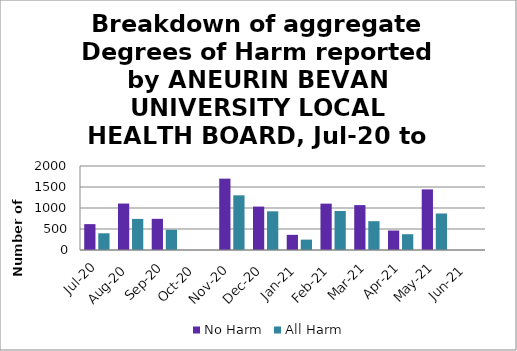
| Category | No Harm | All Harm |
|---|---|---|
| Jul-20 | 616 | 398 |
| Aug-20 | 1106 | 740 |
| Sep-20 | 742 | 482 |
| Oct-20 | 0 | 0 |
| Nov-20 | 1699 | 1302 |
| Dec-20 | 1034 | 921 |
| Jan-21 | 361 | 247 |
| Feb-21 | 1104 | 929 |
| Mar-21 | 1069 | 686 |
| Apr-21 | 464 | 376 |
| May-21 | 1443 | 869 |
| Jun-21 | 0 | 0 |